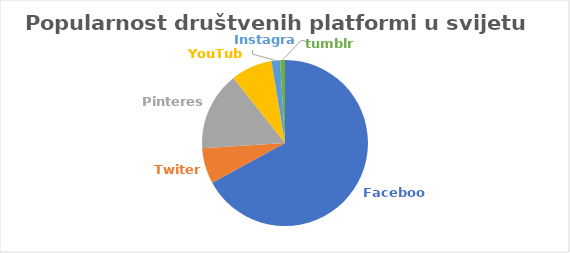
| Category | Series 0 |
|---|---|
| Facebook | 65.75 |
| Twiter | 6.81 |
| Pinterest | 15.06 |
| YouTube | 7.9 |
| Instagram | 1.64 |
| tumblr | 0.93 |